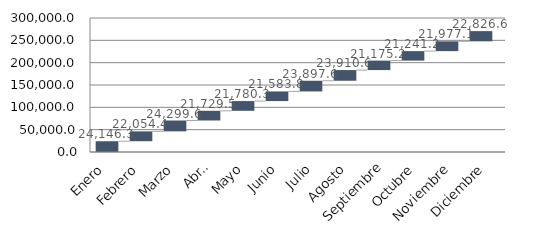
| Category | Combustibles | Eólica | Hidraúlica | Nuclear | Solar fotovoltaica | Solar térmica |
|---|---|---|---|---|---|---|
| Enero | 5342.613 | 7457.622 | 4401.98 | 5086.113 | 1738.472 | 119.508 |
| Febrero | 7728.125 | 4676.576 | 2724.81 | 4598.23 | 2147.858 | 178.785 |
| Marzo | 6418.435 | 6695.548 | 2584.146 | 5100.704 | 3090.86 | 409.94 |
| Abril | 5734.658 | 4900 | 2143.074 | 4570.952 | 3755.085 | 625.723 |
| Mayo | 6345.6 | 5456.474 | 1873.023 | 3751.494 | 3853.371 | 500.293 |
| Junio | 7897.297 | 3081.615 | 2203.384 | 4015.901 | 3843.747 | 541.904 |
| Julio | 8040.818 | 3835.871 | 1600.304 | 5121.873 | 4530.174 | 768.528 |
| Agosto | 8049.173 | 4263.463 | 1380.175 | 5050.952 | 4447.125 | 719.724 |
| Septiembre | 7946.632 | 3589.105 | 1282.352 | 4613.869 | 3343.478 | 399.728 |
| Octubre | 6942.845 | 5764.473 | 1931.912 | 3746.706 | 2628.538 | 226.738 |
| Noviembre | 5209.693 | 6995.902 | 3898.439 | 3767.065 | 1994.693 | 111.284 |
| Diciembre | 5646.35 | 5812.319 | 4419.516 | 4990.409 | 1865.921 | 92.06 |